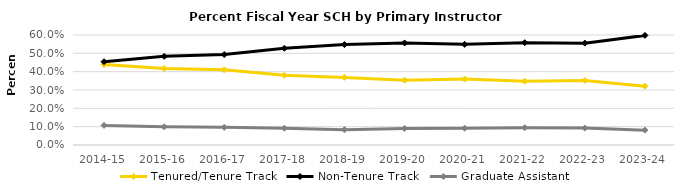
| Category | Tenured/Tenure Track | Non-Tenure Track | Graduate Assistant |
|---|---|---|---|
| 2014-15 | 0.439 | 0.454 | 0.107 |
| 2015-16 | 0.417 | 0.483 | 0.099 |
| 2016-17 | 0.41 | 0.494 | 0.097 |
| 2017-18 | 0.381 | 0.528 | 0.092 |
| 2018-19 | 0.369 | 0.548 | 0.083 |
| 2019-20 | 0.354 | 0.557 | 0.09 |
| 2020-21 | 0.36 | 0.549 | 0.092 |
| 2021-22 | 0.348 | 0.558 | 0.094 |
| 2022-23 | 0.352 | 0.556 | 0.092 |
| 2023-24 | 0.321 | 0.598 | 0.081 |